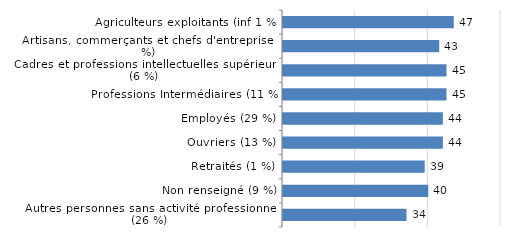
| Category | Taux d'emploi |
|---|---|
| Agriculteurs exploitants (inf 1 %) | 47 |
| Artisans, commerçants et chefs d'entreprise (4 %) | 43 |
| Cadres et professions intellectuelles supérieures (6 %) | 45 |
| Professions Intermédiaires (11 %) | 45 |
| Employés (29 %) | 44 |
| Ouvriers (13 %) | 44 |
| Retraités (1 %) | 39 |
| Non renseigné (9 %) | 40 |
| Autres personnes sans activité professionnelle (26 %) | 34 |